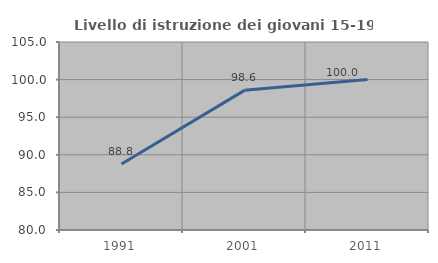
| Category | Livello di istruzione dei giovani 15-19 anni |
|---|---|
| 1991.0 | 88.785 |
| 2001.0 | 98.571 |
| 2011.0 | 100 |